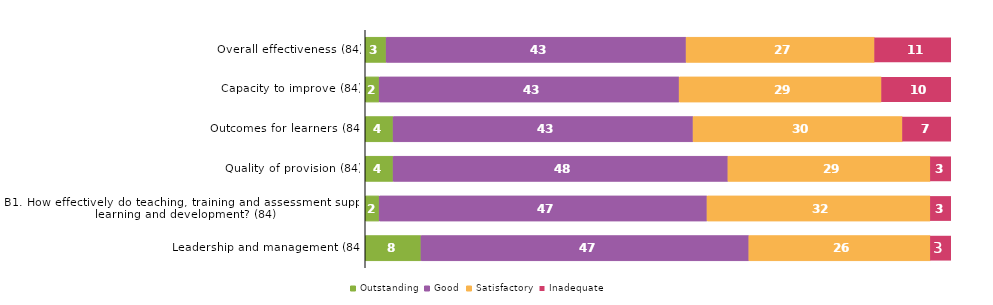
| Category | Outstanding | Good | Satisfactory | Inadequate |
|---|---|---|---|---|
| Overall effectiveness (84) | 3 | 43 | 27 | 11 |
| Capacity to improve (84) | 2 | 43 | 29 | 10 |
| Outcomes for learners (84) | 4 | 43 | 30 | 7 |
| Quality of provision (84) | 4 | 48 | 29 | 3 |
| B1. How effectively do teaching, training and assessment support learning and development? (84) | 2 | 47 | 32 | 3 |
| Leadership and management (84) | 8 | 47 | 26 | 3 |